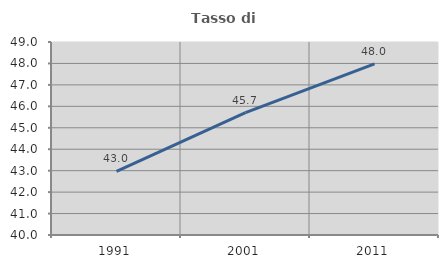
| Category | Tasso di occupazione   |
|---|---|
| 1991.0 | 42.963 |
| 2001.0 | 45.707 |
| 2011.0 | 47.983 |